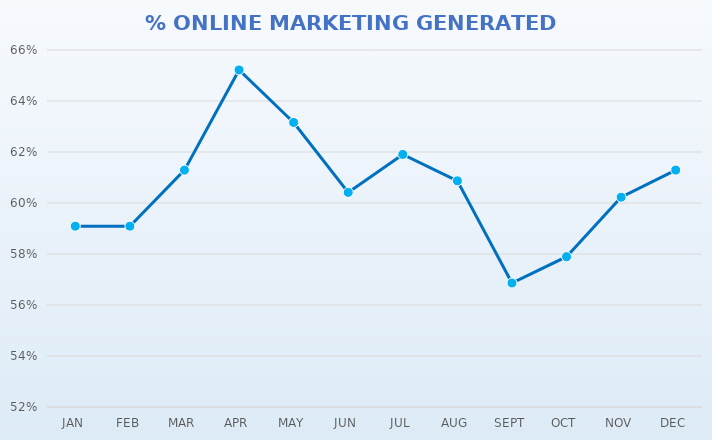
| Category | % RESULTS FROM ONLINE |
|---|---|
| JAN | 0.591 |
| FEB | 0.591 |
| MAR | 0.613 |
| APR | 0.652 |
| MAY | 0.632 |
| JUN | 0.604 |
| JUL | 0.619 |
| AUG | 0.609 |
| SEPT | 0.569 |
| OCT | 0.579 |
| NOV | 0.602 |
| DEC | 0.613 |